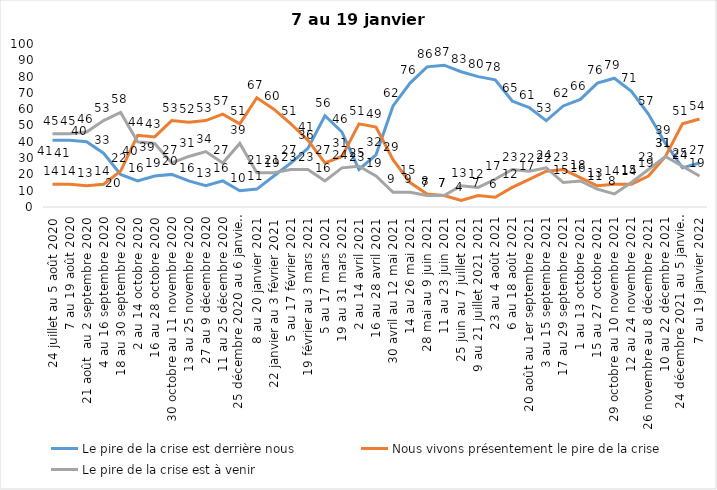
| Category | Le pire de la crise est derrière nous | Nous vivons présentement le pire de la crise | Le pire de la crise est à venir |
|---|---|---|---|
| 24 juillet au 5 août 2020 | 41 | 14 | 45 |
| 7 au 19 août 2020 | 41 | 14 | 45 |
| 21 août  au 2 septembre 2020 | 40 | 13 | 46 |
| 4 au 16 septembre 2020 | 33 | 14 | 53 |
| 18 au 30 septembre 2020 | 20 | 22 | 58 |
| 2 au 14 octobre 2020 | 16 | 44 | 40 |
| 16 au 28 octobre 2020 | 19 | 43 | 39 |
| 30 octobre au 11 novembre 2020 | 20 | 53 | 27 |
| 13 au 25 novembre 2020 | 16 | 52 | 31 |
| 27 au 9 décembre 2020 | 13 | 53 | 34 |
| 11 au 25 décembre 2020 | 16 | 57 | 27 |
| 25 décembre 2020 au 6 janvier 2021 | 10 | 51 | 39 |
| 8 au 20 janvier 2021 | 11 | 67 | 21 |
| 22 janvier au 3 février 2021 | 19 | 60 | 21 |
| 5 au 17 février 2021 | 27 | 51 | 23 |
| 19 février au 3 mars 2021 | 36 | 41 | 23 |
| 5 au 17 mars 2021 | 56 | 27 | 16 |
| 19 au 31 mars 2021 | 46 | 31 | 24 |
| 2 au 14 avril 2021 | 23 | 51 | 25 |
| 16 au 28 avril 2021 | 32 | 49 | 19 |
| 30 avril au 12 mai 2021 | 62 | 29 | 9 |
| 14 au 26 mai 2021 | 76 | 15 | 9 |
| 28 mai au 9 juin 2021 | 86 | 8 | 7 |
| 11 au 23 juin 2021 | 87 | 7 | 7 |
| 25 juin au 7 juillet 2021 | 83 | 4 | 13 |
| 9 au 21 juillet 2021 2021 | 80 | 7 | 12 |
| 23 au 4 août 2021 | 78 | 6 | 17 |
| 6 au 18 août 2021 | 65 | 12 | 23 |
| 20 août au 1er septembre 2021 | 61 | 17 | 22 |
| 3 au 15 septembre 2021 | 53 | 22 | 24 |
| 17 au 29 septembre 2021 | 62 | 23 | 15 |
| 1 au 13 octobre 2021 | 66 | 18 | 16 |
| 15 au 27 octobre 2021 | 76 | 13 | 11 |
| 29 octobre au 10 novembre 2021 | 79 | 14 | 8 |
| 12 au 24 novembre 2021 | 71 | 14 | 15 |
| 26 novembre au 8 décembre 2021 | 57 | 19 | 23 |
| 10 au 22 décembre 2021 | 39 | 31 | 31 |
| 24 décembre 2021 au 5 janvier 2022 2022 | 24 | 51 | 25 |
| 7 au 19 janvier 2022 | 27 | 54 | 19 |